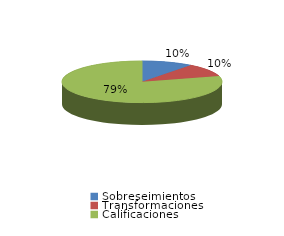
| Category | Series 0 |
|---|---|
| Sobreseimientos | 153 |
| Transformaciones | 151 |
| Calificaciones | 1177 |